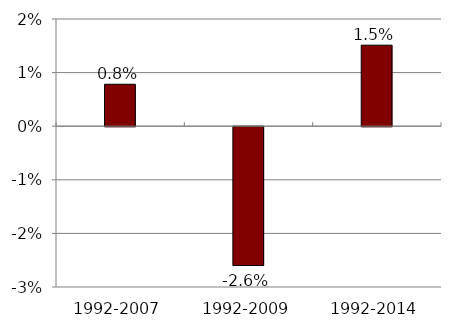
| Category | Series 0 |
|---|---|
| 1992-2007 | 0.008 |
| 1992-2009 | -0.026 |
| 1992-2014 | 0.015 |